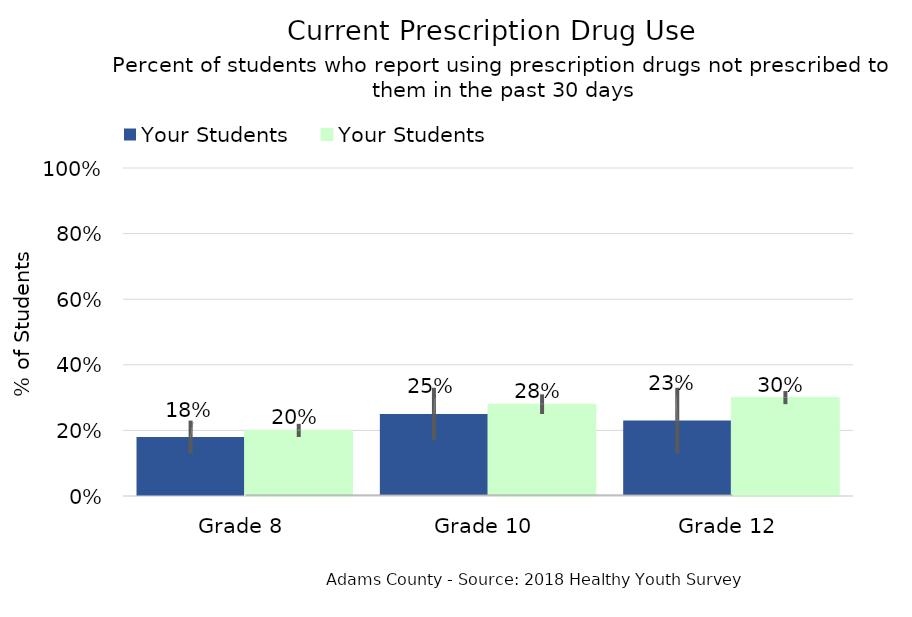
| Category | Your Students |
|---|---|
| Grade 8 | 0.2 |
| Grade 10 | 0.28 |
| Grade 12 | 0.3 |